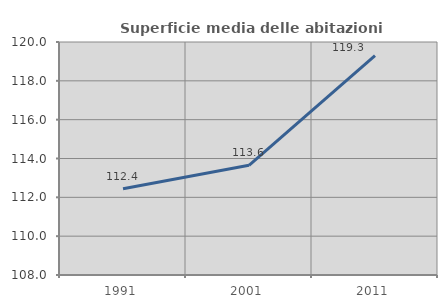
| Category | Superficie media delle abitazioni occupate |
|---|---|
| 1991.0 | 112.444 |
| 2001.0 | 113.65 |
| 2011.0 | 119.303 |